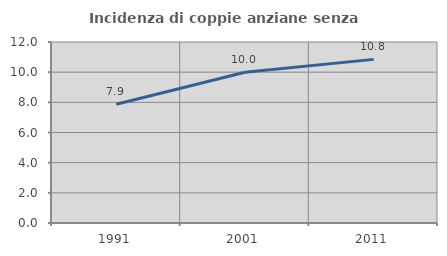
| Category | Incidenza di coppie anziane senza figli  |
|---|---|
| 1991.0 | 7.874 |
| 2001.0 | 9.994 |
| 2011.0 | 10.848 |